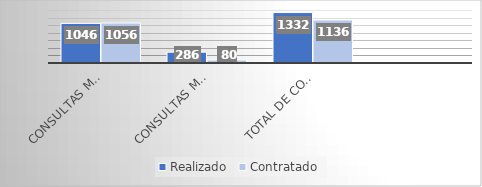
| Category | Realizado | Contratado |
|---|---|---|
| Consultas Médicas | 1046 | 1056 |
| Consultas Multidisciplinares | 286 | 80 |
| Total de Consultas Realizadas | 1332 | 1136 |